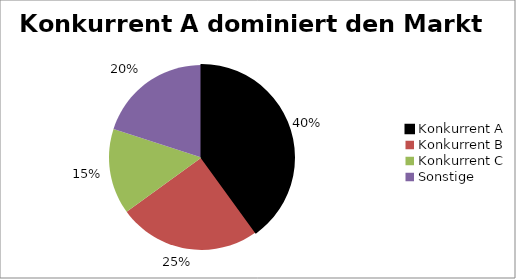
| Category | Series 0 |
|---|---|
| Konkurrent A | 0.4 |
| Konkurrent B | 0.25 |
| Konkurrent C | 0.15 |
| Sonstige | 0.2 |